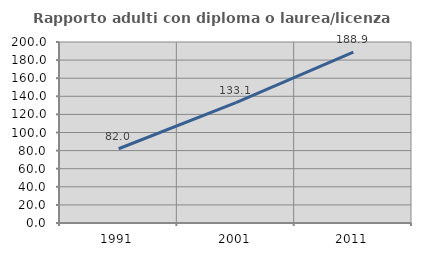
| Category | Rapporto adulti con diploma o laurea/licenza media  |
|---|---|
| 1991.0 | 82.033 |
| 2001.0 | 133.108 |
| 2011.0 | 188.862 |